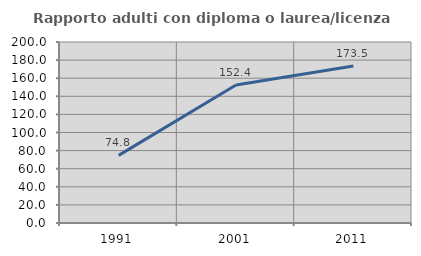
| Category | Rapporto adulti con diploma o laurea/licenza media  |
|---|---|
| 1991.0 | 74.762 |
| 2001.0 | 152.444 |
| 2011.0 | 173.529 |